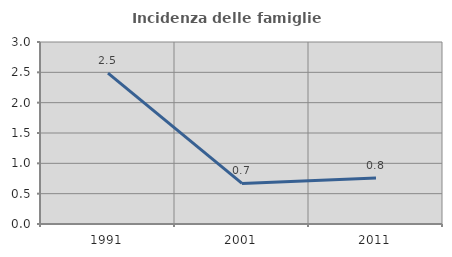
| Category | Incidenza delle famiglie numerose |
|---|---|
| 1991.0 | 2.486 |
| 2001.0 | 0.668 |
| 2011.0 | 0.758 |